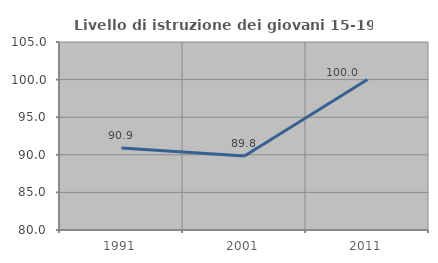
| Category | Livello di istruzione dei giovani 15-19 anni |
|---|---|
| 1991.0 | 90.909 |
| 2001.0 | 89.831 |
| 2011.0 | 100 |